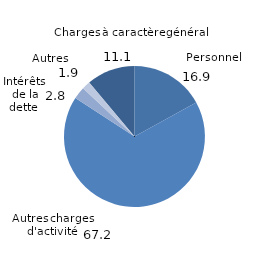
| Category | Series 0 |
|---|---|
| 0 | 11.134 |
| 1 | 16.938 |
| 2 | 67.2 |
| 3 | 2.824 |
| 4 | 1.903 |